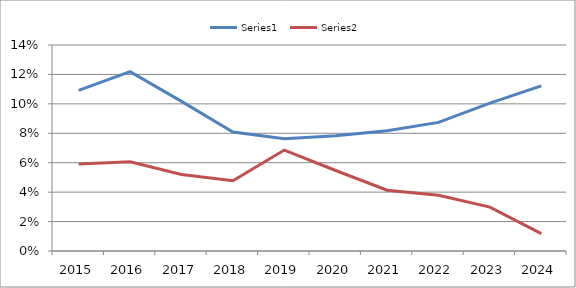
| Category | Series 0 | Series 1 |
|---|---|---|
| 2015.0 | 0.109 | 0.059 |
| 2016.0 | 0.122 | 0.061 |
| 2017.0 | 0.102 | 0.052 |
| 2018.0 | 0.081 | 0.048 |
| 2019.0 | 0.076 | 0.069 |
| 2020.0 | 0.078 | 0.055 |
| 2021.0 | 0.082 | 0.041 |
| 2022.0 | 0.087 | 0.038 |
| 2023.0 | 0.1 | 0.03 |
| 2024.0 | 0.112 | 0.012 |